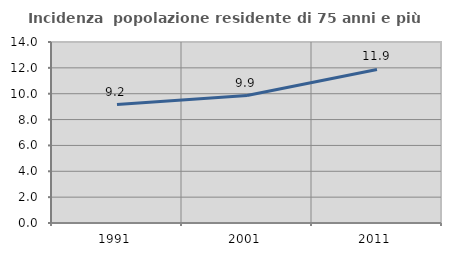
| Category | Incidenza  popolazione residente di 75 anni e più |
|---|---|
| 1991.0 | 9.157 |
| 2001.0 | 9.859 |
| 2011.0 | 11.877 |